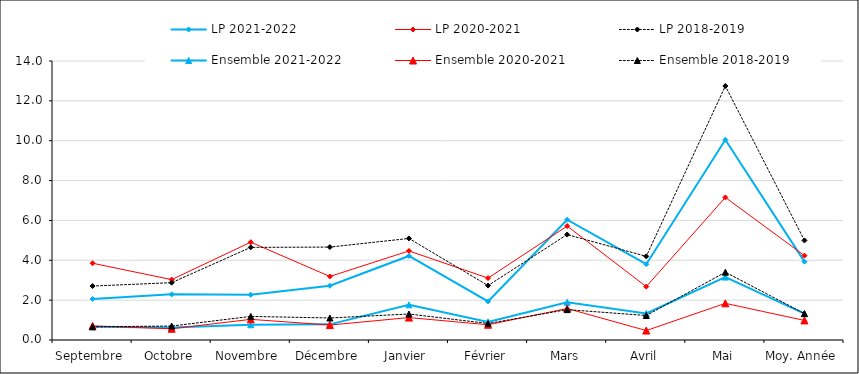
| Category | LP | Ensemble |
|---|---|---|
| Septembre | 2.707 | 0.661 |
| Octobre | 2.877 | 0.701 |
| Novembre | 4.649 | 1.184 |
| Décembre | 4.663 | 1.105 |
| Janvier | 5.096 | 1.305 |
| Février | 2.731 | 0.829 |
| Mars | 5.29 | 1.524 |
| Avril | 4.198 | 1.229 |
| Mai | 12.747 | 3.402 |
| Moy. Année | 4.995 | 1.326 |